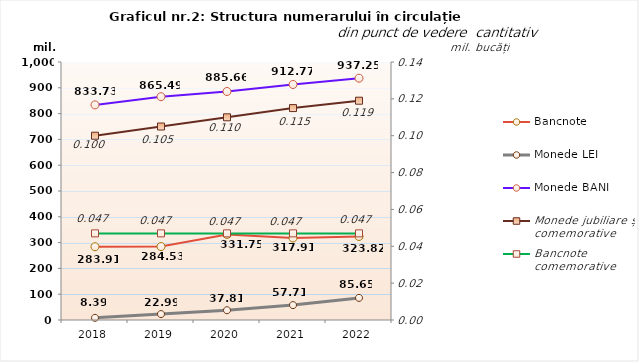
| Category | Bancnote | Monede LEI | Monede BANI |
|---|---|---|---|
| 2018 | 283.91 | 8.39 | 833.73 |
| 2019 | 284.53 | 22.99 | 865.49 |
| 2020 | 331.75 | 37.81 | 885.66 |
| 2021 | 317.91 | 57.71 | 912.77 |
| 2022 | 323.82 | 85.65 | 937.25 |